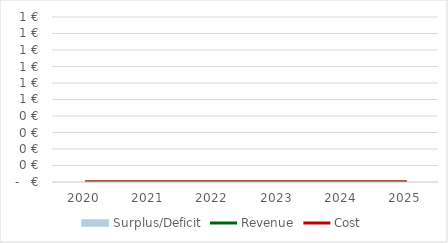
| Category | Surplus/Deficit |
|---|---|
| 0 | 0 |
| 1 | 0 |
| 2 | 0 |
| 3 | 0 |
| 4 | 0 |
| 5 | 0 |